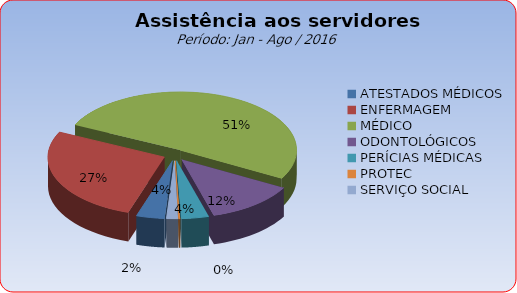
| Category | Series 0 |
|---|---|
| ATESTADOS MÉDICOS | 3.911 |
| ENFERMAGEM | 27.104 |
| MÉDICO | 50.964 |
| ODONTOLÓGICOS | 12.471 |
| PERÍCIAS MÉDICAS | 3.766 |
| PROTEC | 0.198 |
| SERVIÇO SOCIAL | 1.586 |